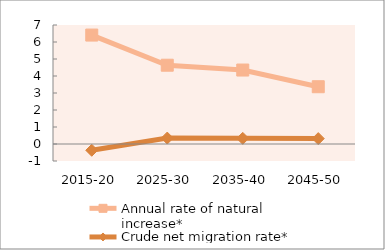
| Category | Annual rate of natural increase* | Crude net migration rate* |
|---|---|---|
| 2015-20 | 6.408 | -0.368 |
| 2025-30 | 4.635 | 0.349 |
| 2035-40 | 4.351 | 0.332 |
| 2045-50 | 3.369 | 0.318 |